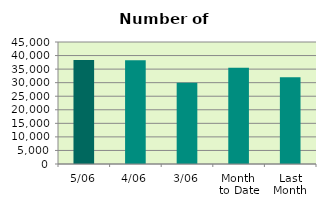
| Category | Series 0 |
|---|---|
| 5/06 | 38382 |
| 4/06 | 38230 |
| 3/06 | 29996 |
| Month 
to Date | 35536 |
| Last
Month | 32020.364 |